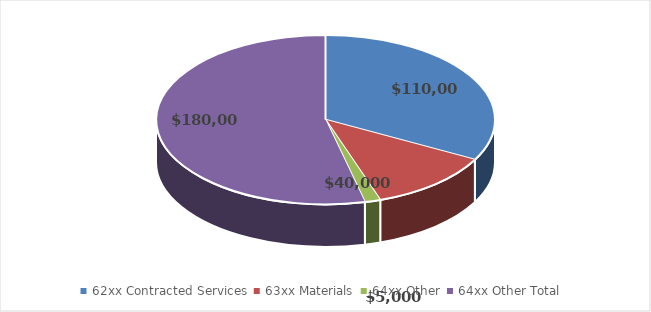
| Category | Series 0 |
|---|---|
| 0 | 110000 |
| 1 | 40000 |
| 2 | 5000 |
| 3 | 180000 |